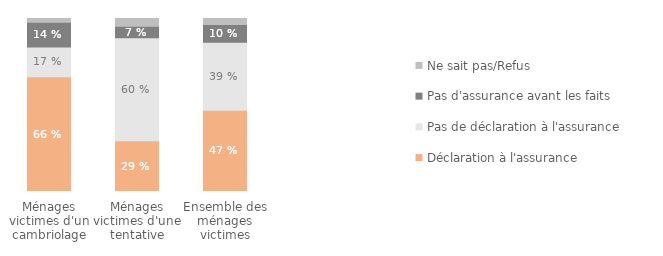
| Category | Déclaration à l'assurance | Pas de déclaration à l'assurance | Pas d'assurance avant les faits | Ne sait pas/Refus |
|---|---|---|---|---|
| Ménages victimes d'un cambriolage | 0.663 | 0.172 | 0.143 | 0.022 |
| Ménages victimes d'une tentative | 0.293 | 0.595 | 0.067 | 0.045 |
| Ensemble des ménages victimes | 0.47 | 0.393 | 0.103 | 0.034 |